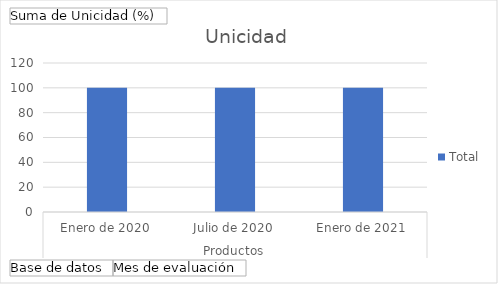
| Category | Total |
|---|---|
| 0 | 100 |
| 1 | 100 |
| 2 | 100 |